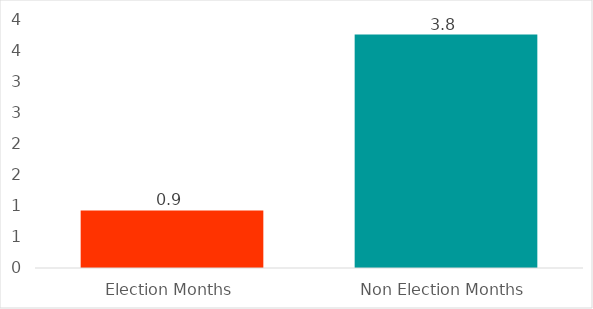
| Category | Average monthly payment |
|---|---|
| Election Months | 0.924 |
| Non Election Months | 3.751 |